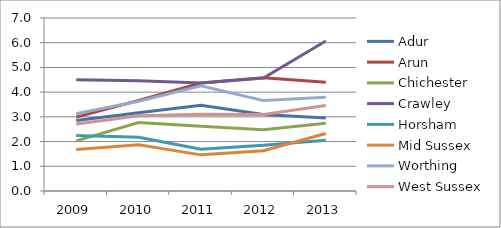
| Category | Adur | Arun | Chichester | Crawley | Horsham | Mid Sussex | Worthing | West Sussex |
|---|---|---|---|---|---|---|---|---|
| 2009.0 | 2.853 | 2.99 | 2.026 | 4.502 | 2.243 | 1.683 | 3.124 | 2.713 |
| 2010.0 | 3.163 | 3.665 | 2.772 | 4.465 | 2.174 | 1.869 | 3.629 | 3.049 |
| 2011.0 | 3.473 | 4.372 | 2.623 | 4.372 | 1.688 | 1.462 | 4.257 | 3.102 |
| 2012.0 | 3.098 | 4.586 | 2.483 | 4.568 | 1.847 | 1.626 | 3.657 | 3.095 |
| 2013.0 | 2.951 | 4.399 | 2.746 | 6.072 | 2.053 | 2.325 | 3.791 | 3.458 |